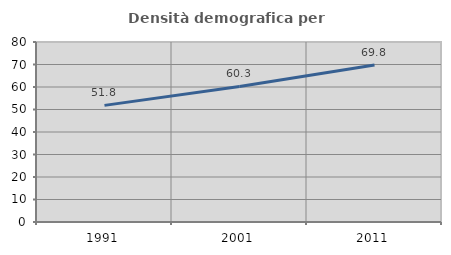
| Category | Densità demografica |
|---|---|
| 1991.0 | 51.831 |
| 2001.0 | 60.252 |
| 2011.0 | 69.793 |